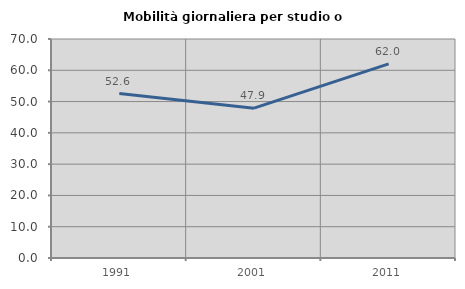
| Category | Mobilità giornaliera per studio o lavoro |
|---|---|
| 1991.0 | 52.577 |
| 2001.0 | 47.895 |
| 2011.0 | 62.048 |